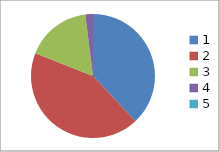
| Category | Series 0 |
|---|---|
| 0 | 0.38 |
| 1 | 0.43 |
| 2 | 0.17 |
| 3 | 0.02 |
| 4 | 0 |